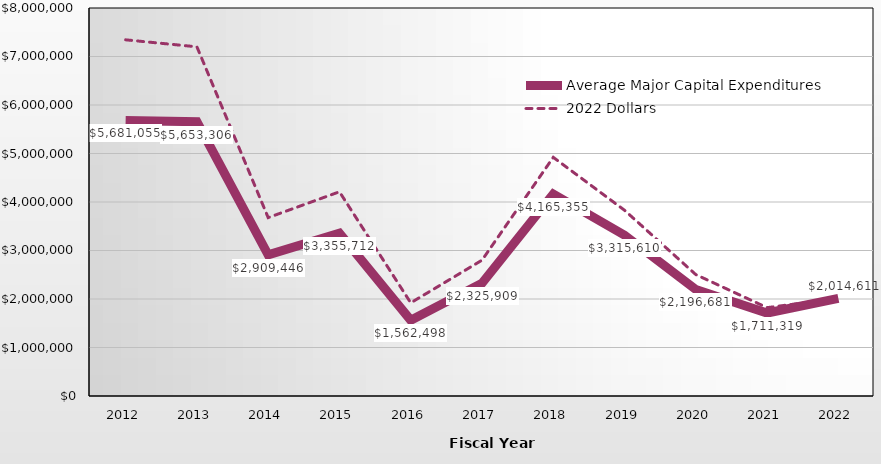
| Category | Average Major Capital Expenditures | 2022 Dollars |
|---|---|---|
| 2012.0 | 5681055 | 7343960.621 |
| 2013.0 | 5653306 | 7199561.587 |
| 2014.0 | 2909446 | 3677842.275 |
| 2015.0 | 3355712 | 4210768.862 |
| 2016.0 | 1562498 | 1920780.363 |
| 2017.0 | 2325909 | 2800101.026 |
| 2018.0 | 4165355 | 4920986.154 |
| 2019.0 | 3315610 | 3829394.14 |
| 2020.0 | 2196681 | 2503219.042 |
| 2021.0 | 1711319 | 1821602.288 |
| 2022.0 | 2014611 | 2014611 |